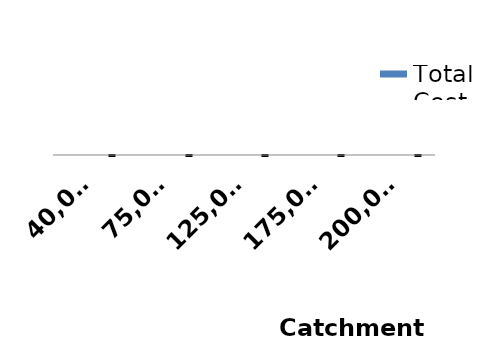
| Category | Total Cost (PKR) |
|---|---|
| 40,000 | 0 |
| 75,000 | 0 |
| 125,000 | 0 |
| 175,000 | 0 |
| 200,000 | 0 |